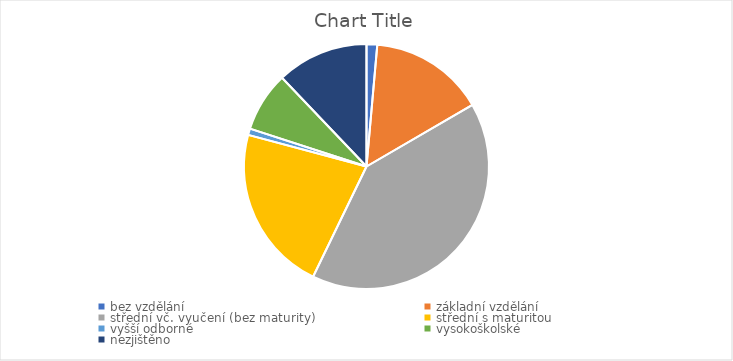
| Category | Series 0 |
|---|---|
| bez vzdělání | 5 |
| základní vzdělání | 54 |
| střední vč. vyučení (bez maturity) | 144 |
| střední s maturitou | 78 |
| vyšší odborné | 3 |
| vysokoškolské | 28 |
| nezjištěno | 43 |